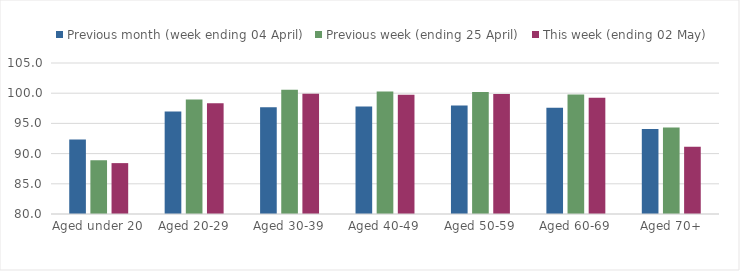
| Category | Previous month (week ending 04 April) | Previous week (ending 25 April) | This week (ending 02 May) |
|---|---|---|---|
| Aged under 20 | 92.315 | 88.913 | 88.425 |
| Aged 20-29 | 96.958 | 98.962 | 98.348 |
| Aged 30-39 | 97.687 | 100.566 | 99.891 |
| Aged 40-49 | 97.801 | 100.262 | 99.735 |
| Aged 50-59 | 97.982 | 100.201 | 99.881 |
| Aged 60-69 | 97.583 | 99.765 | 99.232 |
| Aged 70+ | 94.072 | 94.312 | 91.119 |